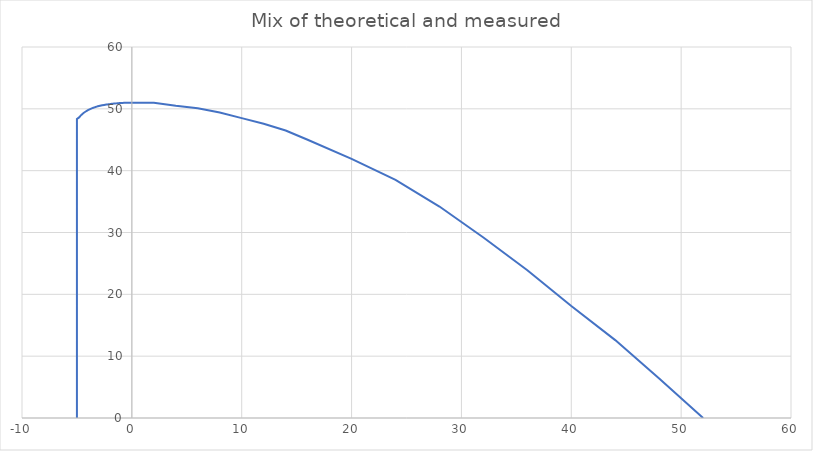
| Category | Series 0 |
|---|---|
| -5.0 | 0 |
| -5.0 | 48.348 |
| -4.8 | 48.615 |
| -4.7 | 48.831 |
| -4.6 | 49.016 |
| -4.5 | 49.177 |
| -4.3999999999999995 | 49.321 |
| -4.3 | 49.451 |
| -4.2 | 49.57 |
| -4.1000000000000005 | 49.679 |
| -4.0 | 49.779 |
| -3.9 | 49.871 |
| -3.8 | 49.957 |
| -3.6999999999999997 | 50.036 |
| -3.5999999999999996 | 50.11 |
| -3.5000000000000004 | 50.178 |
| -3.4000000000000004 | 50.242 |
| -3.3000000000000003 | 50.3 |
| -3.2 | 50.355 |
| -3.1 | 50.405 |
| -3.0 | 50.452 |
| -2.9000000000000004 | 50.495 |
| -2.8000000000000003 | 50.534 |
| -2.7 | 50.569 |
| -2.625 | 50.597 |
| -2.5250000000000004 | 50.628 |
| -2.4250000000000003 | 50.657 |
| -2.325 | 50.685 |
| -2.225 | 50.712 |
| -2.125 | 50.738 |
| -2.025 | 50.762 |
| -1.925 | 50.786 |
| -1.825 | 50.808 |
| -1.725 | 50.828 |
| -1.625 | 50.848 |
| -1.525 | 50.866 |
| -1.425 | 50.883 |
| -1.325 | 50.899 |
| -1.225 | 50.914 |
| -1.125 | 50.927 |
| -1.0250000000000001 | 50.94 |
| -0.9249999999999999 | 50.951 |
| -0.8250000000000001 | 50.961 |
| -0.7250000000000001 | 50.97 |
| -0.625 | 50.978 |
| -0.525 | 50.984 |
| -0.42500000000000004 | 50.99 |
| -0.325 | 50.994 |
| -0.22499999999999998 | 50.997 |
| -0.125 | 50.999 |
| -0.024999999999999703 | 51 |
| 0.0 | 51 |
| 2.0 | 51 |
| 4.0 | 50.5 |
| 6.0 | 50.1 |
| 8.0 | 49.4 |
| 10.0 | 48.5 |
| 12.0 | 47.6 |
| 14.0 | 46.5 |
| 16.0 | 45 |
| 20.0 | 41.9 |
| 24.0 | 38.5 |
| 28.0 | 34.2 |
| 32.0 | 29.2 |
| 36.0 | 23.9 |
| 40.0 | 18.1 |
| 44.0 | 12.6 |
| 48.0 | 6.4 |
| 52.0 | 0 |